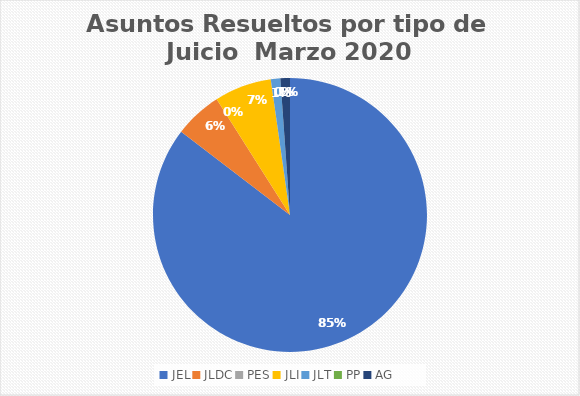
| Category | Asuntos Resueltos por tipo de Juicio  Marzo |
|---|---|
| JEL | 76 |
| JLDC | 5 |
| PES | 0 |
| JLI | 6 |
| JLT | 1 |
| PP | 0 |
| AG | 1 |